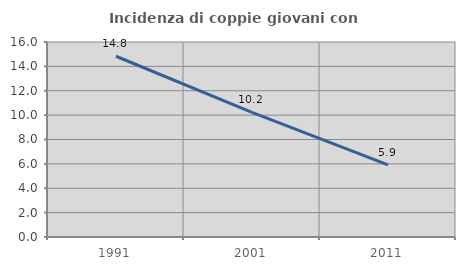
| Category | Incidenza di coppie giovani con figli |
|---|---|
| 1991.0 | 14.83 |
| 2001.0 | 10.218 |
| 2011.0 | 5.913 |